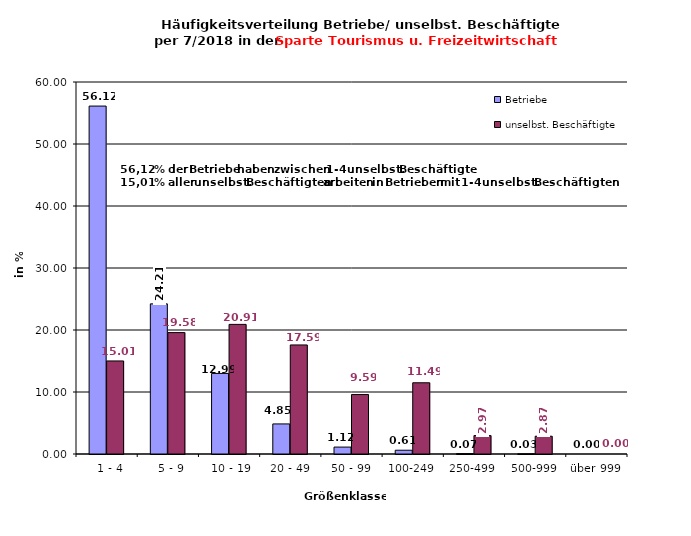
| Category | Betriebe | unselbst. Beschäftigte |
|---|---|---|
|   1 - 4 | 56.117 | 15.008 |
|   5 - 9 | 24.214 | 19.58 |
|  10 - 19 | 12.994 | 20.906 |
| 20 - 49 | 4.85 | 17.591 |
| 50 - 99 | 1.115 | 9.589 |
| 100-249 | 0.608 | 11.489 |
| 250-499 | 0.068 | 2.971 |
| 500-999 | 0.034 | 2.867 |
| über 999 | 0 | 0 |